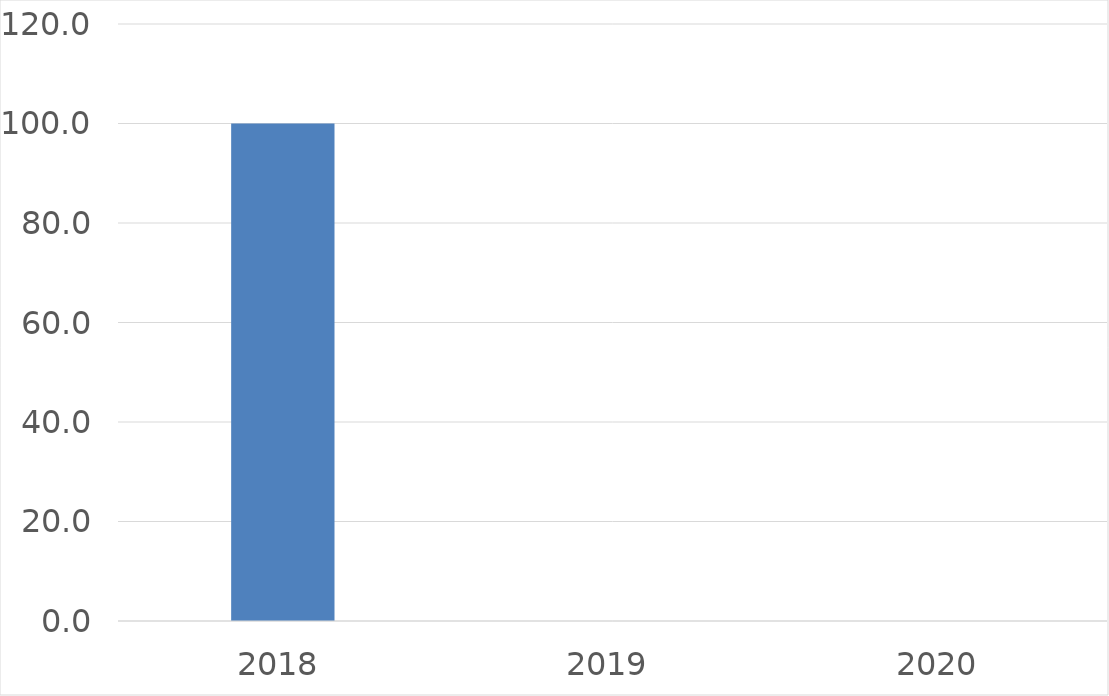
| Category | Series 0 |
|---|---|
| 2018 | 100 |
| 2019 | 0 |
| 2020 | 0 |